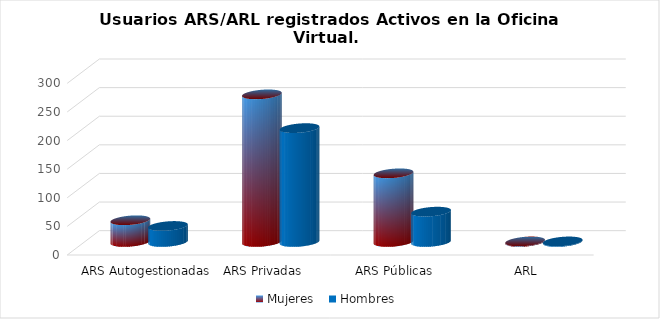
| Category | Mujeres | Hombres |
|---|---|---|
| ARS Autogestionadas | 38 | 28 |
| ARS Privadas | 258 | 199 |
| ARS Públicas | 120 | 53 |
| ARL | 1 | 1 |